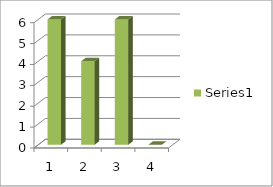
| Category | Series 0 |
|---|---|
| 0 | 6 |
| 1 | 4 |
| 2 | 6 |
| 3 | 0 |